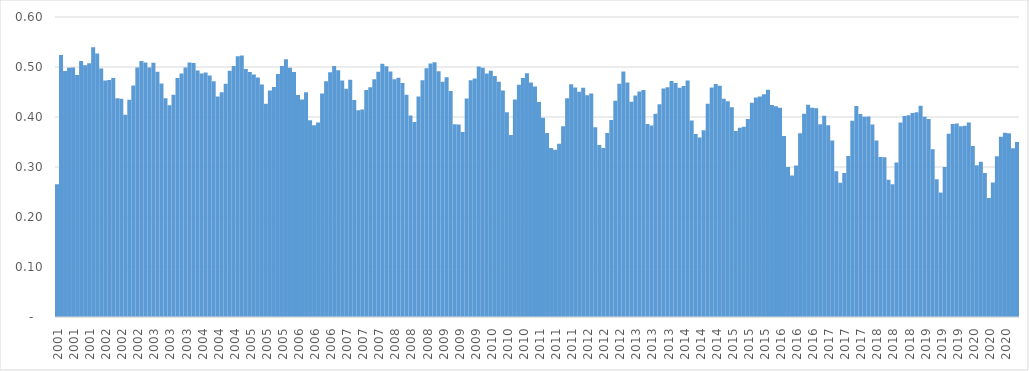
| Category | Series 0 |
|---|---|
| 2001.0 | 0.265 |
| 2001.0 | 0.524 |
| 2001.0 | 0.492 |
| 2001.0 | 0.498 |
| 2001.0 | 0.499 |
| 2001.0 | 0.484 |
| 2001.0 | 0.512 |
| 2001.0 | 0.503 |
| 2001.0 | 0.508 |
| 2001.0 | 0.54 |
| 2001.0 | 0.527 |
| 2001.0 | 0.497 |
| 2002.0 | 0.473 |
| 2002.0 | 0.474 |
| 2002.0 | 0.478 |
| 2002.0 | 0.438 |
| 2002.0 | 0.437 |
| 2002.0 | 0.405 |
| 2002.0 | 0.434 |
| 2002.0 | 0.463 |
| 2002.0 | 0.499 |
| 2002.0 | 0.512 |
| 2002.0 | 0.509 |
| 2002.0 | 0.499 |
| 2003.0 | 0.508 |
| 2003.0 | 0.49 |
| 2003.0 | 0.467 |
| 2003.0 | 0.438 |
| 2003.0 | 0.423 |
| 2003.0 | 0.444 |
| 2003.0 | 0.478 |
| 2003.0 | 0.487 |
| 2003.0 | 0.499 |
| 2003.0 | 0.509 |
| 2003.0 | 0.508 |
| 2003.0 | 0.493 |
| 2004.0 | 0.487 |
| 2004.0 | 0.489 |
| 2004.0 | 0.483 |
| 2004.0 | 0.471 |
| 2004.0 | 0.441 |
| 2004.0 | 0.45 |
| 2004.0 | 0.466 |
| 2004.0 | 0.492 |
| 2004.0 | 0.502 |
| 2004.0 | 0.522 |
| 2004.0 | 0.523 |
| 2004.0 | 0.496 |
| 2005.0 | 0.49 |
| 2005.0 | 0.485 |
| 2005.0 | 0.479 |
| 2005.0 | 0.465 |
| 2005.0 | 0.427 |
| 2005.0 | 0.453 |
| 2005.0 | 0.46 |
| 2005.0 | 0.486 |
| 2005.0 | 0.502 |
| 2005.0 | 0.515 |
| 2005.0 | 0.498 |
| 2005.0 | 0.49 |
| 2006.0 | 0.444 |
| 2006.0 | 0.435 |
| 2006.0 | 0.449 |
| 2006.0 | 0.393 |
| 2006.0 | 0.383 |
| 2006.0 | 0.389 |
| 2006.0 | 0.447 |
| 2006.0 | 0.471 |
| 2006.0 | 0.49 |
| 2006.0 | 0.502 |
| 2006.0 | 0.494 |
| 2006.0 | 0.473 |
| 2007.0 | 0.457 |
| 2007.0 | 0.474 |
| 2007.0 | 0.434 |
| 2007.0 | 0.413 |
| 2007.0 | 0.415 |
| 2007.0 | 0.454 |
| 2007.0 | 0.459 |
| 2007.0 | 0.476 |
| 2007.0 | 0.491 |
| 2007.0 | 0.506 |
| 2007.0 | 0.501 |
| 2007.0 | 0.491 |
| 2008.0 | 0.476 |
| 2008.0 | 0.479 |
| 2008.0 | 0.468 |
| 2008.0 | 0.445 |
| 2008.0 | 0.403 |
| 2008.0 | 0.39 |
| 2008.0 | 0.441 |
| 2008.0 | 0.474 |
| 2008.0 | 0.498 |
| 2008.0 | 0.507 |
| 2008.0 | 0.51 |
| 2008.0 | 0.492 |
| 2009.0 | 0.47 |
| 2009.0 | 0.48 |
| 2009.0 | 0.452 |
| 2009.0 | 0.386 |
| 2009.0 | 0.385 |
| 2009.0 | 0.37 |
| 2009.0 | 0.437 |
| 2009.0 | 0.473 |
| 2009.0 | 0.477 |
| 2009.0 | 0.501 |
| 2009.0 | 0.499 |
| 2009.0 | 0.487 |
| 2010.0 | 0.492 |
| 2010.0 | 0.482 |
| 2010.0 | 0.471 |
| 2010.0 | 0.453 |
| 2010.0 | 0.41 |
| 2010.0 | 0.364 |
| 2010.0 | 0.435 |
| 2010.0 | 0.465 |
| 2010.0 | 0.478 |
| 2010.0 | 0.487 |
| 2010.0 | 0.469 |
| 2010.0 | 0.461 |
| 2011.0 | 0.43 |
| 2011.0 | 0.398 |
| 2011.0 | 0.368 |
| 2011.0 | 0.338 |
| 2011.0 | 0.334 |
| 2011.0 | 0.346 |
| 2011.0 | 0.381 |
| 2011.0 | 0.437 |
| 2011.0 | 0.466 |
| 2011.0 | 0.459 |
| 2011.0 | 0.451 |
| 2011.0 | 0.459 |
| 2012.0 | 0.443 |
| 2012.0 | 0.447 |
| 2012.0 | 0.38 |
| 2012.0 | 0.344 |
| 2012.0 | 0.338 |
| 2012.0 | 0.368 |
| 2012.0 | 0.394 |
| 2012.0 | 0.433 |
| 2012.0 | 0.466 |
| 2012.0 | 0.491 |
| 2012.0 | 0.469 |
| 2012.0 | 0.43 |
| 2013.0 | 0.443 |
| 2013.0 | 0.451 |
| 2013.0 | 0.454 |
| 2013.0 | 0.386 |
| 2013.0 | 0.383 |
| 2013.0 | 0.407 |
| 2013.0 | 0.426 |
| 2013.0 | 0.457 |
| 2013.0 | 0.459 |
| 2013.0 | 0.472 |
| 2013.0 | 0.468 |
| 2013.0 | 0.458 |
| 2014.0 | 0.462 |
| 2014.0 | 0.473 |
| 2014.0 | 0.393 |
| 2014.0 | 0.366 |
| 2014.0 | 0.359 |
| 2014.0 | 0.374 |
| 2014.0 | 0.427 |
| 2014.0 | 0.459 |
| 2014.0 | 0.466 |
| 2014.0 | 0.463 |
| 2014.0 | 0.436 |
| 2014.0 | 0.432 |
| 2015.0 | 0.42 |
| 2015.0 | 0.372 |
| 2015.0 | 0.378 |
| 2015.0 | 0.381 |
| 2015.0 | 0.396 |
| 2015.0 | 0.429 |
| 2015.0 | 0.439 |
| 2015.0 | 0.441 |
| 2015.0 | 0.446 |
| 2015.0 | 0.455 |
| 2015.0 | 0.424 |
| 2015.0 | 0.422 |
| 2016.0 | 0.418 |
| 2016.0 | 0.362 |
| 2016.0 | 0.3 |
| 2016.0 | 0.283 |
| 2016.0 | 0.303 |
| 2016.0 | 0.367 |
| 2016.0 | 0.406 |
| 2016.0 | 0.424 |
| 2016.0 | 0.418 |
| 2016.0 | 0.417 |
| 2016.0 | 0.386 |
| 2016.0 | 0.403 |
| 2017.0 | 0.383 |
| 2017.0 | 0.353 |
| 2017.0 | 0.291 |
| 2017.0 | 0.269 |
| 2017.0 | 0.288 |
| 2017.0 | 0.322 |
| 2017.0 | 0.392 |
| 2017.0 | 0.422 |
| 2017.0 | 0.406 |
| 2017.0 | 0.4 |
| 2017.0 | 0.401 |
| 2017.0 | 0.385 |
| 2018.0 | 0.353 |
| 2018.0 | 0.32 |
| 2018.0 | 0.319 |
| 2018.0 | 0.274 |
| 2018.0 | 0.266 |
| 2018.0 | 0.309 |
| 2018.0 | 0.389 |
| 2018.0 | 0.402 |
| 2018.0 | 0.403 |
| 2018.0 | 0.408 |
| 2018.0 | 0.409 |
| 2018.0 | 0.422 |
| 2019.0 | 0.401 |
| 2019.0 | 0.396 |
| 2019.0 | 0.335 |
| 2019.0 | 0.276 |
| 2019.0 | 0.249 |
| 2019.0 | 0.3 |
| 2019.0 | 0.367 |
| 2019.0 | 0.386 |
| 2019.0 | 0.387 |
| 2019.0 | 0.381 |
| 2019.0 | 0.382 |
| 2019.0 | 0.389 |
| 2020.0 | 0.342 |
| 2020.0 | 0.303 |
| 2020.0 | 0.31 |
| 2020.0 | 0.288 |
| 2020.0 | 0.238 |
| 2020.0 | 0.269 |
| 2020.0 | 0.322 |
| 2020.0 | 0.36 |
| 2020.0 | 0.368 |
| 2020.0 | 0.368 |
| 2020.0 | 0.338 |
| 2020.0 | 0.35 |